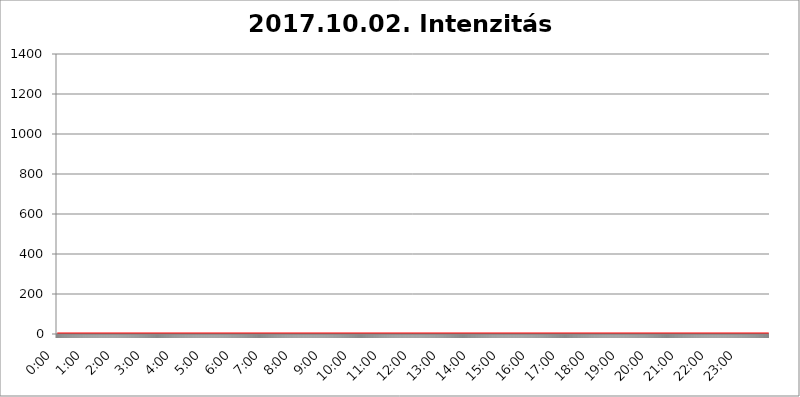
| Category | 2017.10.02. Intenzitás [W/m^2] |
|---|---|
| 0.0 | 0 |
| 0.0006944444444444445 | 0 |
| 0.001388888888888889 | 0 |
| 0.0020833333333333333 | 0 |
| 0.002777777777777778 | 0 |
| 0.003472222222222222 | 0 |
| 0.004166666666666667 | 0 |
| 0.004861111111111111 | 0 |
| 0.005555555555555556 | 0 |
| 0.0062499999999999995 | 0 |
| 0.006944444444444444 | 0 |
| 0.007638888888888889 | 0 |
| 0.008333333333333333 | 0 |
| 0.009027777777777779 | 0 |
| 0.009722222222222222 | 0 |
| 0.010416666666666666 | 0 |
| 0.011111111111111112 | 0 |
| 0.011805555555555555 | 0 |
| 0.012499999999999999 | 0 |
| 0.013194444444444444 | 0 |
| 0.013888888888888888 | 0 |
| 0.014583333333333332 | 0 |
| 0.015277777777777777 | 0 |
| 0.015972222222222224 | 0 |
| 0.016666666666666666 | 0 |
| 0.017361111111111112 | 0 |
| 0.018055555555555557 | 0 |
| 0.01875 | 0 |
| 0.019444444444444445 | 0 |
| 0.02013888888888889 | 0 |
| 0.020833333333333332 | 0 |
| 0.02152777777777778 | 0 |
| 0.022222222222222223 | 0 |
| 0.02291666666666667 | 0 |
| 0.02361111111111111 | 0 |
| 0.024305555555555556 | 0 |
| 0.024999999999999998 | 0 |
| 0.025694444444444447 | 0 |
| 0.02638888888888889 | 0 |
| 0.027083333333333334 | 0 |
| 0.027777777777777776 | 0 |
| 0.02847222222222222 | 0 |
| 0.029166666666666664 | 0 |
| 0.029861111111111113 | 0 |
| 0.030555555555555555 | 0 |
| 0.03125 | 0 |
| 0.03194444444444445 | 0 |
| 0.03263888888888889 | 0 |
| 0.03333333333333333 | 0 |
| 0.034027777777777775 | 0 |
| 0.034722222222222224 | 0 |
| 0.035416666666666666 | 0 |
| 0.036111111111111115 | 0 |
| 0.03680555555555556 | 0 |
| 0.0375 | 0 |
| 0.03819444444444444 | 0 |
| 0.03888888888888889 | 0 |
| 0.03958333333333333 | 0 |
| 0.04027777777777778 | 0 |
| 0.04097222222222222 | 0 |
| 0.041666666666666664 | 0 |
| 0.042361111111111106 | 0 |
| 0.04305555555555556 | 0 |
| 0.043750000000000004 | 0 |
| 0.044444444444444446 | 0 |
| 0.04513888888888889 | 0 |
| 0.04583333333333334 | 0 |
| 0.04652777777777778 | 0 |
| 0.04722222222222222 | 0 |
| 0.04791666666666666 | 0 |
| 0.04861111111111111 | 0 |
| 0.049305555555555554 | 0 |
| 0.049999999999999996 | 0 |
| 0.05069444444444445 | 0 |
| 0.051388888888888894 | 0 |
| 0.052083333333333336 | 0 |
| 0.05277777777777778 | 0 |
| 0.05347222222222222 | 0 |
| 0.05416666666666667 | 0 |
| 0.05486111111111111 | 0 |
| 0.05555555555555555 | 0 |
| 0.05625 | 0 |
| 0.05694444444444444 | 0 |
| 0.057638888888888885 | 0 |
| 0.05833333333333333 | 0 |
| 0.05902777777777778 | 0 |
| 0.059722222222222225 | 0 |
| 0.06041666666666667 | 0 |
| 0.061111111111111116 | 0 |
| 0.06180555555555556 | 0 |
| 0.0625 | 0 |
| 0.06319444444444444 | 0 |
| 0.06388888888888888 | 0 |
| 0.06458333333333334 | 0 |
| 0.06527777777777778 | 0 |
| 0.06597222222222222 | 0 |
| 0.06666666666666667 | 0 |
| 0.06736111111111111 | 0 |
| 0.06805555555555555 | 0 |
| 0.06874999999999999 | 0 |
| 0.06944444444444443 | 0 |
| 0.07013888888888889 | 0 |
| 0.07083333333333333 | 0 |
| 0.07152777777777779 | 0 |
| 0.07222222222222223 | 0 |
| 0.07291666666666667 | 0 |
| 0.07361111111111111 | 0 |
| 0.07430555555555556 | 0 |
| 0.075 | 0 |
| 0.07569444444444444 | 0 |
| 0.0763888888888889 | 0 |
| 0.07708333333333334 | 0 |
| 0.07777777777777778 | 0 |
| 0.07847222222222222 | 0 |
| 0.07916666666666666 | 0 |
| 0.0798611111111111 | 0 |
| 0.08055555555555556 | 0 |
| 0.08125 | 0 |
| 0.08194444444444444 | 0 |
| 0.08263888888888889 | 0 |
| 0.08333333333333333 | 0 |
| 0.08402777777777777 | 0 |
| 0.08472222222222221 | 0 |
| 0.08541666666666665 | 0 |
| 0.08611111111111112 | 0 |
| 0.08680555555555557 | 0 |
| 0.08750000000000001 | 0 |
| 0.08819444444444445 | 0 |
| 0.08888888888888889 | 0 |
| 0.08958333333333333 | 0 |
| 0.09027777777777778 | 0 |
| 0.09097222222222222 | 0 |
| 0.09166666666666667 | 0 |
| 0.09236111111111112 | 0 |
| 0.09305555555555556 | 0 |
| 0.09375 | 0 |
| 0.09444444444444444 | 0 |
| 0.09513888888888888 | 0 |
| 0.09583333333333333 | 0 |
| 0.09652777777777777 | 0 |
| 0.09722222222222222 | 0 |
| 0.09791666666666667 | 0 |
| 0.09861111111111111 | 0 |
| 0.09930555555555555 | 0 |
| 0.09999999999999999 | 0 |
| 0.10069444444444443 | 0 |
| 0.1013888888888889 | 0 |
| 0.10208333333333335 | 0 |
| 0.10277777777777779 | 0 |
| 0.10347222222222223 | 0 |
| 0.10416666666666667 | 0 |
| 0.10486111111111111 | 0 |
| 0.10555555555555556 | 0 |
| 0.10625 | 0 |
| 0.10694444444444444 | 0 |
| 0.1076388888888889 | 0 |
| 0.10833333333333334 | 0 |
| 0.10902777777777778 | 0 |
| 0.10972222222222222 | 0 |
| 0.1111111111111111 | 0 |
| 0.11180555555555556 | 0 |
| 0.11180555555555556 | 0 |
| 0.1125 | 0 |
| 0.11319444444444444 | 0 |
| 0.11388888888888889 | 0 |
| 0.11458333333333333 | 0 |
| 0.11527777777777777 | 0 |
| 0.11597222222222221 | 0 |
| 0.11666666666666665 | 0 |
| 0.1173611111111111 | 0 |
| 0.11805555555555557 | 0 |
| 0.11944444444444445 | 0 |
| 0.12013888888888889 | 0 |
| 0.12083333333333333 | 0 |
| 0.12152777777777778 | 0 |
| 0.12222222222222223 | 0 |
| 0.12291666666666667 | 0 |
| 0.12291666666666667 | 0 |
| 0.12361111111111112 | 0 |
| 0.12430555555555556 | 0 |
| 0.125 | 0 |
| 0.12569444444444444 | 0 |
| 0.12638888888888888 | 0 |
| 0.12708333333333333 | 0 |
| 0.16875 | 0 |
| 0.12847222222222224 | 0 |
| 0.12916666666666668 | 0 |
| 0.12986111111111112 | 0 |
| 0.13055555555555556 | 0 |
| 0.13125 | 0 |
| 0.13194444444444445 | 0 |
| 0.1326388888888889 | 0 |
| 0.13333333333333333 | 0 |
| 0.13402777777777777 | 0 |
| 0.13402777777777777 | 0 |
| 0.13472222222222222 | 0 |
| 0.13541666666666666 | 0 |
| 0.1361111111111111 | 0 |
| 0.13749999999999998 | 0 |
| 0.13819444444444443 | 0 |
| 0.1388888888888889 | 0 |
| 0.13958333333333334 | 0 |
| 0.14027777777777778 | 0 |
| 0.14097222222222222 | 0 |
| 0.14166666666666666 | 0 |
| 0.1423611111111111 | 0 |
| 0.14305555555555557 | 0 |
| 0.14375000000000002 | 0 |
| 0.14444444444444446 | 0 |
| 0.1451388888888889 | 0 |
| 0.1451388888888889 | 0 |
| 0.14652777777777778 | 0 |
| 0.14722222222222223 | 0 |
| 0.14791666666666667 | 0 |
| 0.1486111111111111 | 0 |
| 0.14930555555555555 | 0 |
| 0.15 | 0 |
| 0.15069444444444444 | 0 |
| 0.15138888888888888 | 0 |
| 0.15208333333333332 | 0 |
| 0.15277777777777776 | 0 |
| 0.15347222222222223 | 0 |
| 0.15416666666666667 | 0 |
| 0.15486111111111112 | 0 |
| 0.15555555555555556 | 0 |
| 0.15625 | 0 |
| 0.15694444444444444 | 0 |
| 0.15763888888888888 | 0 |
| 0.15833333333333333 | 0 |
| 0.15902777777777777 | 0 |
| 0.15972222222222224 | 0 |
| 0.16041666666666668 | 0 |
| 0.16111111111111112 | 0 |
| 0.16180555555555556 | 0 |
| 0.1625 | 0 |
| 0.16319444444444445 | 0 |
| 0.1638888888888889 | 0 |
| 0.16458333333333333 | 0 |
| 0.16527777777777777 | 0 |
| 0.16597222222222222 | 0 |
| 0.16666666666666666 | 0 |
| 0.1673611111111111 | 0 |
| 0.16805555555555554 | 0 |
| 0.16874999999999998 | 0 |
| 0.16944444444444443 | 0 |
| 0.17013888888888887 | 0 |
| 0.1708333333333333 | 0 |
| 0.17152777777777775 | 0 |
| 0.17222222222222225 | 0 |
| 0.1729166666666667 | 0 |
| 0.17361111111111113 | 0 |
| 0.17430555555555557 | 0 |
| 0.17500000000000002 | 0 |
| 0.17569444444444446 | 0 |
| 0.1763888888888889 | 0 |
| 0.17708333333333334 | 0 |
| 0.17777777777777778 | 0 |
| 0.17847222222222223 | 0 |
| 0.17916666666666667 | 0 |
| 0.1798611111111111 | 0 |
| 0.18055555555555555 | 0 |
| 0.18125 | 0 |
| 0.18194444444444444 | 0 |
| 0.1826388888888889 | 0 |
| 0.18333333333333335 | 0 |
| 0.1840277777777778 | 0 |
| 0.18472222222222223 | 0 |
| 0.18541666666666667 | 0 |
| 0.18611111111111112 | 0 |
| 0.18680555555555556 | 0 |
| 0.1875 | 0 |
| 0.18819444444444444 | 0 |
| 0.18888888888888888 | 0 |
| 0.18958333333333333 | 0 |
| 0.19027777777777777 | 0 |
| 0.1909722222222222 | 0 |
| 0.19166666666666665 | 0 |
| 0.19236111111111112 | 0 |
| 0.19305555555555554 | 0 |
| 0.19375 | 0 |
| 0.19444444444444445 | 0 |
| 0.1951388888888889 | 0 |
| 0.19583333333333333 | 0 |
| 0.19652777777777777 | 0 |
| 0.19722222222222222 | 0 |
| 0.19791666666666666 | 0 |
| 0.1986111111111111 | 0 |
| 0.19930555555555554 | 0 |
| 0.19999999999999998 | 0 |
| 0.20069444444444443 | 0 |
| 0.20138888888888887 | 0 |
| 0.2020833333333333 | 0 |
| 0.2027777777777778 | 0 |
| 0.2034722222222222 | 0 |
| 0.2041666666666667 | 0 |
| 0.20486111111111113 | 0 |
| 0.20555555555555557 | 0 |
| 0.20625000000000002 | 0 |
| 0.20694444444444446 | 0 |
| 0.2076388888888889 | 0 |
| 0.20833333333333334 | 0 |
| 0.20902777777777778 | 0 |
| 0.20972222222222223 | 0 |
| 0.21041666666666667 | 0 |
| 0.2111111111111111 | 0 |
| 0.21180555555555555 | 0 |
| 0.2125 | 0 |
| 0.21319444444444444 | 0 |
| 0.2138888888888889 | 0 |
| 0.21458333333333335 | 0 |
| 0.2152777777777778 | 0 |
| 0.21597222222222223 | 0 |
| 0.21666666666666667 | 0 |
| 0.21736111111111112 | 0 |
| 0.21805555555555556 | 0 |
| 0.21875 | 0 |
| 0.21944444444444444 | 0 |
| 0.22013888888888888 | 0 |
| 0.22083333333333333 | 0 |
| 0.22152777777777777 | 0 |
| 0.2222222222222222 | 0 |
| 0.22291666666666665 | 0 |
| 0.2236111111111111 | 0 |
| 0.22430555555555556 | 0 |
| 0.225 | 0 |
| 0.22569444444444445 | 0 |
| 0.2263888888888889 | 0 |
| 0.22708333333333333 | 0 |
| 0.22777777777777777 | 0 |
| 0.22847222222222222 | 0 |
| 0.22916666666666666 | 0 |
| 0.2298611111111111 | 0 |
| 0.23055555555555554 | 0 |
| 0.23124999999999998 | 0 |
| 0.23194444444444443 | 0 |
| 0.23263888888888887 | 0 |
| 0.2333333333333333 | 0 |
| 0.2340277777777778 | 0 |
| 0.2347222222222222 | 0 |
| 0.2354166666666667 | 0 |
| 0.23611111111111113 | 0 |
| 0.23680555555555557 | 0 |
| 0.23750000000000002 | 0 |
| 0.23819444444444446 | 0 |
| 0.2388888888888889 | 0 |
| 0.23958333333333334 | 0 |
| 0.24027777777777778 | 0 |
| 0.24097222222222223 | 0 |
| 0.24166666666666667 | 0 |
| 0.2423611111111111 | 0 |
| 0.24305555555555555 | 0 |
| 0.24375 | 0 |
| 0.24444444444444446 | 0 |
| 0.24513888888888888 | 0 |
| 0.24583333333333335 | 0 |
| 0.2465277777777778 | 0 |
| 0.24722222222222223 | 0 |
| 0.24791666666666667 | 0 |
| 0.24861111111111112 | 0 |
| 0.24930555555555556 | 0 |
| 0.25 | 0 |
| 0.25069444444444444 | 0 |
| 0.2513888888888889 | 0 |
| 0.2520833333333333 | 0 |
| 0.25277777777777777 | 0 |
| 0.2534722222222222 | 0 |
| 0.25416666666666665 | 0 |
| 0.2548611111111111 | 0 |
| 0.2555555555555556 | 0 |
| 0.25625000000000003 | 0 |
| 0.2569444444444445 | 0 |
| 0.2576388888888889 | 0 |
| 0.25833333333333336 | 0 |
| 0.2590277777777778 | 0 |
| 0.25972222222222224 | 0 |
| 0.2604166666666667 | 0 |
| 0.2611111111111111 | 0 |
| 0.26180555555555557 | 0 |
| 0.2625 | 0 |
| 0.26319444444444445 | 0 |
| 0.2638888888888889 | 0 |
| 0.26458333333333334 | 0 |
| 0.2652777777777778 | 0 |
| 0.2659722222222222 | 0 |
| 0.26666666666666666 | 0 |
| 0.2673611111111111 | 0 |
| 0.26805555555555555 | 0 |
| 0.26875 | 0 |
| 0.26944444444444443 | 0 |
| 0.2701388888888889 | 0 |
| 0.2708333333333333 | 0 |
| 0.27152777777777776 | 0 |
| 0.2722222222222222 | 0 |
| 0.27291666666666664 | 0 |
| 0.2736111111111111 | 0 |
| 0.2743055555555555 | 0 |
| 0.27499999999999997 | 0 |
| 0.27569444444444446 | 0 |
| 0.27638888888888885 | 0 |
| 0.27708333333333335 | 0 |
| 0.2777777777777778 | 0 |
| 0.27847222222222223 | 0 |
| 0.2791666666666667 | 0 |
| 0.2798611111111111 | 0 |
| 0.28055555555555556 | 0 |
| 0.28125 | 0 |
| 0.28194444444444444 | 0 |
| 0.2826388888888889 | 0 |
| 0.2833333333333333 | 0 |
| 0.28402777777777777 | 0 |
| 0.2847222222222222 | 0 |
| 0.28541666666666665 | 0 |
| 0.28611111111111115 | 0 |
| 0.28680555555555554 | 0 |
| 0.28750000000000003 | 0 |
| 0.2881944444444445 | 0 |
| 0.2888888888888889 | 0 |
| 0.28958333333333336 | 0 |
| 0.2902777777777778 | 0 |
| 0.29097222222222224 | 0 |
| 0.2916666666666667 | 0 |
| 0.2923611111111111 | 0 |
| 0.29305555555555557 | 0 |
| 0.29375 | 0 |
| 0.29444444444444445 | 0 |
| 0.2951388888888889 | 0 |
| 0.29583333333333334 | 0 |
| 0.2965277777777778 | 0 |
| 0.2972222222222222 | 0 |
| 0.29791666666666666 | 0 |
| 0.2986111111111111 | 0 |
| 0.29930555555555555 | 0 |
| 0.3 | 0 |
| 0.30069444444444443 | 0 |
| 0.3013888888888889 | 0 |
| 0.3020833333333333 | 0 |
| 0.30277777777777776 | 0 |
| 0.3034722222222222 | 0 |
| 0.30416666666666664 | 0 |
| 0.3048611111111111 | 0 |
| 0.3055555555555555 | 0 |
| 0.30624999999999997 | 0 |
| 0.3069444444444444 | 0 |
| 0.3076388888888889 | 0 |
| 0.30833333333333335 | 0 |
| 0.3090277777777778 | 0 |
| 0.30972222222222223 | 0 |
| 0.3104166666666667 | 0 |
| 0.3111111111111111 | 0 |
| 0.31180555555555556 | 0 |
| 0.3125 | 0 |
| 0.31319444444444444 | 0 |
| 0.3138888888888889 | 0 |
| 0.3145833333333333 | 0 |
| 0.31527777777777777 | 0 |
| 0.3159722222222222 | 0 |
| 0.31666666666666665 | 0 |
| 0.31736111111111115 | 0 |
| 0.31805555555555554 | 0 |
| 0.31875000000000003 | 0 |
| 0.3194444444444445 | 0 |
| 0.3201388888888889 | 0 |
| 0.32083333333333336 | 0 |
| 0.3215277777777778 | 0 |
| 0.32222222222222224 | 0 |
| 0.3229166666666667 | 0 |
| 0.3236111111111111 | 0 |
| 0.32430555555555557 | 0 |
| 0.325 | 0 |
| 0.32569444444444445 | 0 |
| 0.3263888888888889 | 0 |
| 0.32708333333333334 | 0 |
| 0.3277777777777778 | 0 |
| 0.3284722222222222 | 0 |
| 0.32916666666666666 | 0 |
| 0.3298611111111111 | 0 |
| 0.33055555555555555 | 0 |
| 0.33125 | 0 |
| 0.33194444444444443 | 0 |
| 0.3326388888888889 | 0 |
| 0.3333333333333333 | 0 |
| 0.3340277777777778 | 0 |
| 0.3347222222222222 | 0 |
| 0.3354166666666667 | 0 |
| 0.3361111111111111 | 0 |
| 0.3368055555555556 | 0 |
| 0.33749999999999997 | 0 |
| 0.33819444444444446 | 0 |
| 0.33888888888888885 | 0 |
| 0.33958333333333335 | 0 |
| 0.34027777777777773 | 0 |
| 0.34097222222222223 | 0 |
| 0.3416666666666666 | 0 |
| 0.3423611111111111 | 0 |
| 0.3430555555555555 | 0 |
| 0.34375 | 0 |
| 0.3444444444444445 | 0 |
| 0.3451388888888889 | 0 |
| 0.3458333333333334 | 0 |
| 0.34652777777777777 | 0 |
| 0.34722222222222227 | 0 |
| 0.34791666666666665 | 0 |
| 0.34861111111111115 | 0 |
| 0.34930555555555554 | 0 |
| 0.35000000000000003 | 0 |
| 0.3506944444444444 | 0 |
| 0.3513888888888889 | 0 |
| 0.3520833333333333 | 0 |
| 0.3527777777777778 | 0 |
| 0.3534722222222222 | 0 |
| 0.3541666666666667 | 0 |
| 0.3548611111111111 | 0 |
| 0.35555555555555557 | 0 |
| 0.35625 | 0 |
| 0.35694444444444445 | 0 |
| 0.3576388888888889 | 0 |
| 0.35833333333333334 | 0 |
| 0.3590277777777778 | 0 |
| 0.3597222222222222 | 0 |
| 0.36041666666666666 | 0 |
| 0.3611111111111111 | 0 |
| 0.36180555555555555 | 0 |
| 0.3625 | 0 |
| 0.36319444444444443 | 0 |
| 0.3638888888888889 | 0 |
| 0.3645833333333333 | 0 |
| 0.3652777777777778 | 0 |
| 0.3659722222222222 | 0 |
| 0.3666666666666667 | 0 |
| 0.3673611111111111 | 0 |
| 0.3680555555555556 | 0 |
| 0.36874999999999997 | 0 |
| 0.36944444444444446 | 0 |
| 0.37013888888888885 | 0 |
| 0.37083333333333335 | 0 |
| 0.37152777777777773 | 0 |
| 0.37222222222222223 | 0 |
| 0.3729166666666666 | 0 |
| 0.3736111111111111 | 0 |
| 0.3743055555555555 | 0 |
| 0.375 | 0 |
| 0.3756944444444445 | 0 |
| 0.3763888888888889 | 0 |
| 0.3770833333333334 | 0 |
| 0.37777777777777777 | 0 |
| 0.37847222222222227 | 0 |
| 0.37916666666666665 | 0 |
| 0.37986111111111115 | 0 |
| 0.38055555555555554 | 0 |
| 0.38125000000000003 | 0 |
| 0.3819444444444444 | 0 |
| 0.3826388888888889 | 0 |
| 0.3833333333333333 | 0 |
| 0.3840277777777778 | 0 |
| 0.3847222222222222 | 0 |
| 0.3854166666666667 | 0 |
| 0.3861111111111111 | 0 |
| 0.38680555555555557 | 0 |
| 0.3875 | 0 |
| 0.38819444444444445 | 0 |
| 0.3888888888888889 | 0 |
| 0.38958333333333334 | 0 |
| 0.3902777777777778 | 0 |
| 0.3909722222222222 | 0 |
| 0.39166666666666666 | 0 |
| 0.3923611111111111 | 0 |
| 0.39305555555555555 | 0 |
| 0.39375 | 0 |
| 0.39444444444444443 | 0 |
| 0.3951388888888889 | 0 |
| 0.3958333333333333 | 0 |
| 0.3965277777777778 | 0 |
| 0.3972222222222222 | 0 |
| 0.3979166666666667 | 0 |
| 0.3986111111111111 | 0 |
| 0.3993055555555556 | 0 |
| 0.39999999999999997 | 0 |
| 0.40069444444444446 | 0 |
| 0.40138888888888885 | 0 |
| 0.40208333333333335 | 0 |
| 0.40277777777777773 | 0 |
| 0.40347222222222223 | 0 |
| 0.4041666666666666 | 0 |
| 0.4048611111111111 | 0 |
| 0.4055555555555555 | 0 |
| 0.40625 | 0 |
| 0.4069444444444445 | 0 |
| 0.4076388888888889 | 0 |
| 0.4083333333333334 | 0 |
| 0.40902777777777777 | 0 |
| 0.40972222222222227 | 0 |
| 0.41041666666666665 | 0 |
| 0.41111111111111115 | 0 |
| 0.41180555555555554 | 0 |
| 0.41250000000000003 | 0 |
| 0.4131944444444444 | 0 |
| 0.4138888888888889 | 0 |
| 0.4145833333333333 | 0 |
| 0.4152777777777778 | 0 |
| 0.4159722222222222 | 0 |
| 0.4166666666666667 | 0 |
| 0.4173611111111111 | 0 |
| 0.41805555555555557 | 0 |
| 0.41875 | 0 |
| 0.41944444444444445 | 0 |
| 0.4201388888888889 | 0 |
| 0.42083333333333334 | 0 |
| 0.4215277777777778 | 0 |
| 0.4222222222222222 | 0 |
| 0.42291666666666666 | 0 |
| 0.4236111111111111 | 0 |
| 0.42430555555555555 | 0 |
| 0.425 | 0 |
| 0.42569444444444443 | 0 |
| 0.4263888888888889 | 0 |
| 0.4270833333333333 | 0 |
| 0.4277777777777778 | 0 |
| 0.4284722222222222 | 0 |
| 0.4291666666666667 | 0 |
| 0.4298611111111111 | 0 |
| 0.4305555555555556 | 0 |
| 0.43124999999999997 | 0 |
| 0.43194444444444446 | 0 |
| 0.43263888888888885 | 0 |
| 0.43333333333333335 | 0 |
| 0.43402777777777773 | 0 |
| 0.43472222222222223 | 0 |
| 0.4354166666666666 | 0 |
| 0.4361111111111111 | 0 |
| 0.4368055555555555 | 0 |
| 0.4375 | 0 |
| 0.4381944444444445 | 0 |
| 0.4388888888888889 | 0 |
| 0.4395833333333334 | 0 |
| 0.44027777777777777 | 0 |
| 0.44097222222222227 | 0 |
| 0.44166666666666665 | 0 |
| 0.44236111111111115 | 0 |
| 0.44305555555555554 | 0 |
| 0.44375000000000003 | 0 |
| 0.4444444444444444 | 0 |
| 0.4451388888888889 | 0 |
| 0.4458333333333333 | 0 |
| 0.4465277777777778 | 0 |
| 0.4472222222222222 | 0 |
| 0.4479166666666667 | 0 |
| 0.4486111111111111 | 0 |
| 0.44930555555555557 | 0 |
| 0.45 | 0 |
| 0.45069444444444445 | 0 |
| 0.4513888888888889 | 0 |
| 0.45208333333333334 | 0 |
| 0.4527777777777778 | 0 |
| 0.4534722222222222 | 0 |
| 0.45416666666666666 | 0 |
| 0.4548611111111111 | 0 |
| 0.45555555555555555 | 0 |
| 0.45625 | 0 |
| 0.45694444444444443 | 0 |
| 0.4576388888888889 | 0 |
| 0.4583333333333333 | 0 |
| 0.4590277777777778 | 0 |
| 0.4597222222222222 | 0 |
| 0.4604166666666667 | 0 |
| 0.4611111111111111 | 0 |
| 0.4618055555555556 | 0 |
| 0.46249999999999997 | 0 |
| 0.46319444444444446 | 0 |
| 0.46388888888888885 | 0 |
| 0.46458333333333335 | 0 |
| 0.46527777777777773 | 0 |
| 0.46597222222222223 | 0 |
| 0.4666666666666666 | 0 |
| 0.4673611111111111 | 0 |
| 0.4680555555555555 | 0 |
| 0.46875 | 0 |
| 0.4694444444444445 | 0 |
| 0.4701388888888889 | 0 |
| 0.4708333333333334 | 0 |
| 0.47152777777777777 | 0 |
| 0.47222222222222227 | 0 |
| 0.47291666666666665 | 0 |
| 0.47361111111111115 | 0 |
| 0.47430555555555554 | 0 |
| 0.47500000000000003 | 0 |
| 0.4756944444444444 | 0 |
| 0.4763888888888889 | 0 |
| 0.4770833333333333 | 0 |
| 0.4777777777777778 | 0 |
| 0.4784722222222222 | 0 |
| 0.4791666666666667 | 0 |
| 0.4798611111111111 | 0 |
| 0.48055555555555557 | 0 |
| 0.48125 | 0 |
| 0.48194444444444445 | 0 |
| 0.4826388888888889 | 0 |
| 0.48333333333333334 | 0 |
| 0.4840277777777778 | 0 |
| 0.4847222222222222 | 0 |
| 0.48541666666666666 | 0 |
| 0.4861111111111111 | 0 |
| 0.48680555555555555 | 0 |
| 0.4875 | 0 |
| 0.48819444444444443 | 0 |
| 0.4888888888888889 | 0 |
| 0.4895833333333333 | 0 |
| 0.4902777777777778 | 0 |
| 0.4909722222222222 | 0 |
| 0.4916666666666667 | 0 |
| 0.4923611111111111 | 0 |
| 0.4930555555555556 | 0 |
| 0.49374999999999997 | 0 |
| 0.49444444444444446 | 0 |
| 0.49513888888888885 | 0 |
| 0.49583333333333335 | 0 |
| 0.49652777777777773 | 0 |
| 0.49722222222222223 | 0 |
| 0.4979166666666666 | 0 |
| 0.4986111111111111 | 0 |
| 0.4993055555555555 | 0 |
| 0.5 | 0 |
| 0.5006944444444444 | 0 |
| 0.5013888888888889 | 0 |
| 0.5020833333333333 | 0 |
| 0.5027777777777778 | 0 |
| 0.5034722222222222 | 0 |
| 0.5041666666666667 | 0 |
| 0.5048611111111111 | 0 |
| 0.5055555555555555 | 0 |
| 0.50625 | 0 |
| 0.5069444444444444 | 0 |
| 0.5076388888888889 | 0 |
| 0.5083333333333333 | 0 |
| 0.5090277777777777 | 0 |
| 0.5097222222222222 | 0 |
| 0.5104166666666666 | 0 |
| 0.5111111111111112 | 0 |
| 0.5118055555555555 | 0 |
| 0.5125000000000001 | 0 |
| 0.5131944444444444 | 0 |
| 0.513888888888889 | 0 |
| 0.5145833333333333 | 0 |
| 0.5152777777777778 | 0 |
| 0.5159722222222222 | 0 |
| 0.5166666666666667 | 0 |
| 0.517361111111111 | 0 |
| 0.5180555555555556 | 0 |
| 0.5187499999999999 | 0 |
| 0.5194444444444445 | 0 |
| 0.5201388888888888 | 0 |
| 0.5208333333333334 | 0 |
| 0.5215277777777778 | 0 |
| 0.5222222222222223 | 0 |
| 0.5229166666666667 | 0 |
| 0.5236111111111111 | 0 |
| 0.5243055555555556 | 0 |
| 0.525 | 0 |
| 0.5256944444444445 | 0 |
| 0.5263888888888889 | 0 |
| 0.5270833333333333 | 0 |
| 0.5277777777777778 | 0 |
| 0.5284722222222222 | 0 |
| 0.5291666666666667 | 0 |
| 0.5298611111111111 | 0 |
| 0.5305555555555556 | 0 |
| 0.53125 | 0 |
| 0.5319444444444444 | 0 |
| 0.5326388888888889 | 0 |
| 0.5333333333333333 | 0 |
| 0.5340277777777778 | 0 |
| 0.5347222222222222 | 0 |
| 0.5354166666666667 | 0 |
| 0.5361111111111111 | 0 |
| 0.5368055555555555 | 0 |
| 0.5375 | 0 |
| 0.5381944444444444 | 0 |
| 0.5388888888888889 | 0 |
| 0.5395833333333333 | 0 |
| 0.5402777777777777 | 0 |
| 0.5409722222222222 | 0 |
| 0.5416666666666666 | 0 |
| 0.5423611111111112 | 0 |
| 0.5430555555555555 | 0 |
| 0.5437500000000001 | 0 |
| 0.5444444444444444 | 0 |
| 0.545138888888889 | 0 |
| 0.5458333333333333 | 0 |
| 0.5465277777777778 | 0 |
| 0.5472222222222222 | 0 |
| 0.5479166666666667 | 0 |
| 0.548611111111111 | 0 |
| 0.5493055555555556 | 0 |
| 0.5499999999999999 | 0 |
| 0.5506944444444445 | 0 |
| 0.5513888888888888 | 0 |
| 0.5520833333333334 | 0 |
| 0.5527777777777778 | 0 |
| 0.5534722222222223 | 0 |
| 0.5541666666666667 | 0 |
| 0.5548611111111111 | 0 |
| 0.5555555555555556 | 0 |
| 0.55625 | 0 |
| 0.5569444444444445 | 0 |
| 0.5576388888888889 | 0 |
| 0.5583333333333333 | 0 |
| 0.5590277777777778 | 0 |
| 0.5597222222222222 | 0 |
| 0.5604166666666667 | 0 |
| 0.5611111111111111 | 0 |
| 0.5618055555555556 | 0 |
| 0.5625 | 0 |
| 0.5631944444444444 | 0 |
| 0.5638888888888889 | 0 |
| 0.5645833333333333 | 0 |
| 0.5652777777777778 | 0 |
| 0.5659722222222222 | 0 |
| 0.5666666666666667 | 0 |
| 0.5673611111111111 | 0 |
| 0.5680555555555555 | 0 |
| 0.56875 | 0 |
| 0.5694444444444444 | 0 |
| 0.5701388888888889 | 0 |
| 0.5708333333333333 | 0 |
| 0.5715277777777777 | 0 |
| 0.5722222222222222 | 0 |
| 0.5729166666666666 | 0 |
| 0.5736111111111112 | 0 |
| 0.5743055555555555 | 0 |
| 0.5750000000000001 | 0 |
| 0.5756944444444444 | 0 |
| 0.576388888888889 | 0 |
| 0.5770833333333333 | 0 |
| 0.5777777777777778 | 0 |
| 0.5784722222222222 | 0 |
| 0.5791666666666667 | 0 |
| 0.579861111111111 | 0 |
| 0.5805555555555556 | 0 |
| 0.5812499999999999 | 0 |
| 0.5819444444444445 | 0 |
| 0.5826388888888888 | 0 |
| 0.5833333333333334 | 0 |
| 0.5840277777777778 | 0 |
| 0.5847222222222223 | 0 |
| 0.5854166666666667 | 0 |
| 0.5861111111111111 | 0 |
| 0.5868055555555556 | 0 |
| 0.5875 | 0 |
| 0.5881944444444445 | 0 |
| 0.5888888888888889 | 0 |
| 0.5895833333333333 | 0 |
| 0.5902777777777778 | 0 |
| 0.5909722222222222 | 0 |
| 0.5916666666666667 | 0 |
| 0.5923611111111111 | 0 |
| 0.5930555555555556 | 0 |
| 0.59375 | 0 |
| 0.5944444444444444 | 0 |
| 0.5951388888888889 | 0 |
| 0.5958333333333333 | 0 |
| 0.5965277777777778 | 0 |
| 0.5972222222222222 | 0 |
| 0.5979166666666667 | 0 |
| 0.5986111111111111 | 0 |
| 0.5993055555555555 | 0 |
| 0.6 | 0 |
| 0.6006944444444444 | 0 |
| 0.6013888888888889 | 0 |
| 0.6020833333333333 | 0 |
| 0.6027777777777777 | 0 |
| 0.6034722222222222 | 0 |
| 0.6041666666666666 | 0 |
| 0.6048611111111112 | 0 |
| 0.6055555555555555 | 0 |
| 0.6062500000000001 | 0 |
| 0.6069444444444444 | 0 |
| 0.607638888888889 | 0 |
| 0.6083333333333333 | 0 |
| 0.6090277777777778 | 0 |
| 0.6097222222222222 | 0 |
| 0.6104166666666667 | 0 |
| 0.611111111111111 | 0 |
| 0.6118055555555556 | 0 |
| 0.6124999999999999 | 0 |
| 0.6131944444444445 | 0 |
| 0.6138888888888888 | 0 |
| 0.6145833333333334 | 0 |
| 0.6152777777777778 | 0 |
| 0.6159722222222223 | 0 |
| 0.6166666666666667 | 0 |
| 0.6173611111111111 | 0 |
| 0.6180555555555556 | 0 |
| 0.61875 | 0 |
| 0.6194444444444445 | 0 |
| 0.6201388888888889 | 0 |
| 0.6208333333333333 | 0 |
| 0.6215277777777778 | 0 |
| 0.6222222222222222 | 0 |
| 0.6229166666666667 | 0 |
| 0.6236111111111111 | 0 |
| 0.6243055555555556 | 0 |
| 0.625 | 0 |
| 0.6256944444444444 | 0 |
| 0.6263888888888889 | 0 |
| 0.6270833333333333 | 0 |
| 0.6277777777777778 | 0 |
| 0.6284722222222222 | 0 |
| 0.6291666666666667 | 0 |
| 0.6298611111111111 | 0 |
| 0.6305555555555555 | 0 |
| 0.63125 | 0 |
| 0.6319444444444444 | 0 |
| 0.6326388888888889 | 0 |
| 0.6333333333333333 | 0 |
| 0.6340277777777777 | 0 |
| 0.6347222222222222 | 0 |
| 0.6354166666666666 | 0 |
| 0.6361111111111112 | 0 |
| 0.6368055555555555 | 0 |
| 0.6375000000000001 | 0 |
| 0.6381944444444444 | 0 |
| 0.638888888888889 | 0 |
| 0.6395833333333333 | 0 |
| 0.6402777777777778 | 0 |
| 0.6409722222222222 | 0 |
| 0.6416666666666667 | 0 |
| 0.642361111111111 | 0 |
| 0.6430555555555556 | 0 |
| 0.6437499999999999 | 0 |
| 0.6444444444444445 | 0 |
| 0.6451388888888888 | 0 |
| 0.6458333333333334 | 0 |
| 0.6465277777777778 | 0 |
| 0.6472222222222223 | 0 |
| 0.6479166666666667 | 0 |
| 0.6486111111111111 | 0 |
| 0.6493055555555556 | 0 |
| 0.65 | 0 |
| 0.6506944444444445 | 0 |
| 0.6513888888888889 | 0 |
| 0.6520833333333333 | 0 |
| 0.6527777777777778 | 0 |
| 0.6534722222222222 | 0 |
| 0.6541666666666667 | 0 |
| 0.6548611111111111 | 0 |
| 0.6555555555555556 | 0 |
| 0.65625 | 0 |
| 0.6569444444444444 | 0 |
| 0.6576388888888889 | 0 |
| 0.6583333333333333 | 0 |
| 0.6590277777777778 | 0 |
| 0.6597222222222222 | 0 |
| 0.6604166666666667 | 0 |
| 0.6611111111111111 | 0 |
| 0.6618055555555555 | 0 |
| 0.6625 | 0 |
| 0.6631944444444444 | 0 |
| 0.6638888888888889 | 0 |
| 0.6645833333333333 | 0 |
| 0.6652777777777777 | 0 |
| 0.6659722222222222 | 0 |
| 0.6666666666666666 | 0 |
| 0.6673611111111111 | 0 |
| 0.6680555555555556 | 0 |
| 0.6687500000000001 | 0 |
| 0.6694444444444444 | 0 |
| 0.6701388888888888 | 0 |
| 0.6708333333333334 | 0 |
| 0.6715277777777778 | 0 |
| 0.6722222222222222 | 0 |
| 0.6729166666666666 | 0 |
| 0.6736111111111112 | 0 |
| 0.6743055555555556 | 0 |
| 0.6749999999999999 | 0 |
| 0.6756944444444444 | 0 |
| 0.6763888888888889 | 0 |
| 0.6770833333333334 | 0 |
| 0.6777777777777777 | 0 |
| 0.6784722222222223 | 0 |
| 0.6791666666666667 | 0 |
| 0.6798611111111111 | 0 |
| 0.6805555555555555 | 0 |
| 0.68125 | 0 |
| 0.6819444444444445 | 0 |
| 0.6826388888888889 | 0 |
| 0.6833333333333332 | 0 |
| 0.6840277777777778 | 0 |
| 0.6847222222222222 | 0 |
| 0.6854166666666667 | 0 |
| 0.686111111111111 | 0 |
| 0.6868055555555556 | 0 |
| 0.6875 | 0 |
| 0.6881944444444444 | 0 |
| 0.688888888888889 | 0 |
| 0.6895833333333333 | 0 |
| 0.6902777777777778 | 0 |
| 0.6909722222222222 | 0 |
| 0.6916666666666668 | 0 |
| 0.6923611111111111 | 0 |
| 0.6930555555555555 | 0 |
| 0.69375 | 0 |
| 0.6944444444444445 | 0 |
| 0.6951388888888889 | 0 |
| 0.6958333333333333 | 0 |
| 0.6965277777777777 | 0 |
| 0.6972222222222223 | 0 |
| 0.6979166666666666 | 0 |
| 0.6986111111111111 | 0 |
| 0.6993055555555556 | 0 |
| 0.7000000000000001 | 0 |
| 0.7006944444444444 | 0 |
| 0.7013888888888888 | 0 |
| 0.7020833333333334 | 0 |
| 0.7027777777777778 | 0 |
| 0.7034722222222222 | 0 |
| 0.7041666666666666 | 0 |
| 0.7048611111111112 | 0 |
| 0.7055555555555556 | 0 |
| 0.7062499999999999 | 0 |
| 0.7069444444444444 | 0 |
| 0.7076388888888889 | 0 |
| 0.7083333333333334 | 0 |
| 0.7090277777777777 | 0 |
| 0.7097222222222223 | 0 |
| 0.7104166666666667 | 0 |
| 0.7111111111111111 | 0 |
| 0.7118055555555555 | 0 |
| 0.7125 | 0 |
| 0.7131944444444445 | 0 |
| 0.7138888888888889 | 0 |
| 0.7145833333333332 | 0 |
| 0.7152777777777778 | 0 |
| 0.7159722222222222 | 0 |
| 0.7166666666666667 | 0 |
| 0.717361111111111 | 0 |
| 0.7180555555555556 | 0 |
| 0.71875 | 0 |
| 0.7194444444444444 | 0 |
| 0.720138888888889 | 0 |
| 0.7208333333333333 | 0 |
| 0.7215277777777778 | 0 |
| 0.7222222222222222 | 0 |
| 0.7229166666666668 | 0 |
| 0.7236111111111111 | 0 |
| 0.7243055555555555 | 0 |
| 0.725 | 0 |
| 0.7256944444444445 | 0 |
| 0.7263888888888889 | 0 |
| 0.7270833333333333 | 0 |
| 0.7277777777777777 | 0 |
| 0.7284722222222223 | 0 |
| 0.7291666666666666 | 0 |
| 0.7298611111111111 | 0 |
| 0.7305555555555556 | 0 |
| 0.7312500000000001 | 0 |
| 0.7319444444444444 | 0 |
| 0.7326388888888888 | 0 |
| 0.7333333333333334 | 0 |
| 0.7340277777777778 | 0 |
| 0.7347222222222222 | 0 |
| 0.7354166666666666 | 0 |
| 0.7361111111111112 | 0 |
| 0.7368055555555556 | 0 |
| 0.7374999999999999 | 0 |
| 0.7381944444444444 | 0 |
| 0.7388888888888889 | 0 |
| 0.7395833333333334 | 0 |
| 0.7402777777777777 | 0 |
| 0.7409722222222223 | 0 |
| 0.7416666666666667 | 0 |
| 0.7423611111111111 | 0 |
| 0.7430555555555555 | 0 |
| 0.74375 | 0 |
| 0.7444444444444445 | 0 |
| 0.7451388888888889 | 0 |
| 0.7458333333333332 | 0 |
| 0.7465277777777778 | 0 |
| 0.7472222222222222 | 0 |
| 0.7479166666666667 | 0 |
| 0.748611111111111 | 0 |
| 0.7493055555555556 | 0 |
| 0.75 | 0 |
| 0.7506944444444444 | 0 |
| 0.751388888888889 | 0 |
| 0.7520833333333333 | 0 |
| 0.7527777777777778 | 0 |
| 0.7534722222222222 | 0 |
| 0.7541666666666668 | 0 |
| 0.7548611111111111 | 0 |
| 0.7555555555555555 | 0 |
| 0.75625 | 0 |
| 0.7569444444444445 | 0 |
| 0.7576388888888889 | 0 |
| 0.7583333333333333 | 0 |
| 0.7590277777777777 | 0 |
| 0.7597222222222223 | 0 |
| 0.7604166666666666 | 0 |
| 0.7611111111111111 | 0 |
| 0.7618055555555556 | 0 |
| 0.7625000000000001 | 0 |
| 0.7631944444444444 | 0 |
| 0.7638888888888888 | 0 |
| 0.7645833333333334 | 0 |
| 0.7652777777777778 | 0 |
| 0.7659722222222222 | 0 |
| 0.7666666666666666 | 0 |
| 0.7673611111111112 | 0 |
| 0.7680555555555556 | 0 |
| 0.7687499999999999 | 0 |
| 0.7694444444444444 | 0 |
| 0.7701388888888889 | 0 |
| 0.7708333333333334 | 0 |
| 0.7715277777777777 | 0 |
| 0.7722222222222223 | 0 |
| 0.7729166666666667 | 0 |
| 0.7736111111111111 | 0 |
| 0.7743055555555555 | 0 |
| 0.775 | 0 |
| 0.7756944444444445 | 0 |
| 0.7763888888888889 | 0 |
| 0.7770833333333332 | 0 |
| 0.7777777777777778 | 0 |
| 0.7784722222222222 | 0 |
| 0.7791666666666667 | 0 |
| 0.779861111111111 | 0 |
| 0.7805555555555556 | 0 |
| 0.78125 | 0 |
| 0.7819444444444444 | 0 |
| 0.782638888888889 | 0 |
| 0.7833333333333333 | 0 |
| 0.7840277777777778 | 0 |
| 0.7847222222222222 | 0 |
| 0.7854166666666668 | 0 |
| 0.7861111111111111 | 0 |
| 0.7868055555555555 | 0 |
| 0.7875 | 0 |
| 0.7881944444444445 | 0 |
| 0.7888888888888889 | 0 |
| 0.7895833333333333 | 0 |
| 0.7902777777777777 | 0 |
| 0.7909722222222223 | 0 |
| 0.7916666666666666 | 0 |
| 0.7923611111111111 | 0 |
| 0.7930555555555556 | 0 |
| 0.7937500000000001 | 0 |
| 0.7944444444444444 | 0 |
| 0.7951388888888888 | 0 |
| 0.7958333333333334 | 0 |
| 0.7965277777777778 | 0 |
| 0.7972222222222222 | 0 |
| 0.7979166666666666 | 0 |
| 0.7986111111111112 | 0 |
| 0.7993055555555556 | 0 |
| 0.7999999999999999 | 0 |
| 0.8006944444444444 | 0 |
| 0.8013888888888889 | 0 |
| 0.8020833333333334 | 0 |
| 0.8027777777777777 | 0 |
| 0.8034722222222223 | 0 |
| 0.8041666666666667 | 0 |
| 0.8048611111111111 | 0 |
| 0.8055555555555555 | 0 |
| 0.80625 | 0 |
| 0.8069444444444445 | 0 |
| 0.8076388888888889 | 0 |
| 0.8083333333333332 | 0 |
| 0.8090277777777778 | 0 |
| 0.8097222222222222 | 0 |
| 0.8104166666666667 | 0 |
| 0.811111111111111 | 0 |
| 0.8118055555555556 | 0 |
| 0.8125 | 0 |
| 0.8131944444444444 | 0 |
| 0.813888888888889 | 0 |
| 0.8145833333333333 | 0 |
| 0.8152777777777778 | 0 |
| 0.8159722222222222 | 0 |
| 0.8166666666666668 | 0 |
| 0.8173611111111111 | 0 |
| 0.8180555555555555 | 0 |
| 0.81875 | 0 |
| 0.8194444444444445 | 0 |
| 0.8201388888888889 | 0 |
| 0.8208333333333333 | 0 |
| 0.8215277777777777 | 0 |
| 0.8222222222222223 | 0 |
| 0.8229166666666666 | 0 |
| 0.8236111111111111 | 0 |
| 0.8243055555555556 | 0 |
| 0.8250000000000001 | 0 |
| 0.8256944444444444 | 0 |
| 0.8263888888888888 | 0 |
| 0.8270833333333334 | 0 |
| 0.8277777777777778 | 0 |
| 0.8284722222222222 | 0 |
| 0.8291666666666666 | 0 |
| 0.8298611111111112 | 0 |
| 0.8305555555555556 | 0 |
| 0.8312499999999999 | 0 |
| 0.8319444444444444 | 0 |
| 0.8326388888888889 | 0 |
| 0.8333333333333334 | 0 |
| 0.8340277777777777 | 0 |
| 0.8347222222222223 | 0 |
| 0.8354166666666667 | 0 |
| 0.8361111111111111 | 0 |
| 0.8368055555555555 | 0 |
| 0.8375 | 0 |
| 0.8381944444444445 | 0 |
| 0.8388888888888889 | 0 |
| 0.8395833333333332 | 0 |
| 0.8402777777777778 | 0 |
| 0.8409722222222222 | 0 |
| 0.8416666666666667 | 0 |
| 0.842361111111111 | 0 |
| 0.8430555555555556 | 0 |
| 0.84375 | 0 |
| 0.8444444444444444 | 0 |
| 0.845138888888889 | 0 |
| 0.8458333333333333 | 0 |
| 0.8465277777777778 | 0 |
| 0.8472222222222222 | 0 |
| 0.8479166666666668 | 0 |
| 0.8486111111111111 | 0 |
| 0.8493055555555555 | 0 |
| 0.85 | 0 |
| 0.8506944444444445 | 0 |
| 0.8513888888888889 | 0 |
| 0.8520833333333333 | 0 |
| 0.8527777777777777 | 0 |
| 0.8534722222222223 | 0 |
| 0.8541666666666666 | 0 |
| 0.8548611111111111 | 0 |
| 0.8555555555555556 | 0 |
| 0.8562500000000001 | 0 |
| 0.8569444444444444 | 0 |
| 0.8576388888888888 | 0 |
| 0.8583333333333334 | 0 |
| 0.8590277777777778 | 0 |
| 0.8597222222222222 | 0 |
| 0.8604166666666666 | 0 |
| 0.8611111111111112 | 0 |
| 0.8618055555555556 | 0 |
| 0.8624999999999999 | 0 |
| 0.8631944444444444 | 0 |
| 0.8638888888888889 | 0 |
| 0.8645833333333334 | 0 |
| 0.8652777777777777 | 0 |
| 0.8659722222222223 | 0 |
| 0.8666666666666667 | 0 |
| 0.8673611111111111 | 0 |
| 0.8680555555555555 | 0 |
| 0.86875 | 0 |
| 0.8694444444444445 | 0 |
| 0.8701388888888889 | 0 |
| 0.8708333333333332 | 0 |
| 0.8715277777777778 | 0 |
| 0.8722222222222222 | 0 |
| 0.8729166666666667 | 0 |
| 0.873611111111111 | 0 |
| 0.8743055555555556 | 0 |
| 0.875 | 0 |
| 0.8756944444444444 | 0 |
| 0.876388888888889 | 0 |
| 0.8770833333333333 | 0 |
| 0.8777777777777778 | 0 |
| 0.8784722222222222 | 0 |
| 0.8791666666666668 | 0 |
| 0.8798611111111111 | 0 |
| 0.8805555555555555 | 0 |
| 0.88125 | 0 |
| 0.8819444444444445 | 0 |
| 0.8826388888888889 | 0 |
| 0.8833333333333333 | 0 |
| 0.8840277777777777 | 0 |
| 0.8847222222222223 | 0 |
| 0.8854166666666666 | 0 |
| 0.8861111111111111 | 0 |
| 0.8868055555555556 | 0 |
| 0.8875000000000001 | 0 |
| 0.8881944444444444 | 0 |
| 0.8888888888888888 | 0 |
| 0.8895833333333334 | 0 |
| 0.8902777777777778 | 0 |
| 0.8909722222222222 | 0 |
| 0.8916666666666666 | 0 |
| 0.8923611111111112 | 0 |
| 0.8930555555555556 | 0 |
| 0.8937499999999999 | 0 |
| 0.8944444444444444 | 0 |
| 0.8951388888888889 | 0 |
| 0.8958333333333334 | 0 |
| 0.8965277777777777 | 0 |
| 0.8972222222222223 | 0 |
| 0.8979166666666667 | 0 |
| 0.8986111111111111 | 0 |
| 0.8993055555555555 | 0 |
| 0.9 | 0 |
| 0.9006944444444445 | 0 |
| 0.9013888888888889 | 0 |
| 0.9020833333333332 | 0 |
| 0.9027777777777778 | 0 |
| 0.9034722222222222 | 0 |
| 0.9041666666666667 | 0 |
| 0.904861111111111 | 0 |
| 0.9055555555555556 | 0 |
| 0.90625 | 0 |
| 0.9069444444444444 | 0 |
| 0.907638888888889 | 0 |
| 0.9083333333333333 | 0 |
| 0.9090277777777778 | 0 |
| 0.9097222222222222 | 0 |
| 0.9104166666666668 | 0 |
| 0.9111111111111111 | 0 |
| 0.9118055555555555 | 0 |
| 0.9125 | 0 |
| 0.9131944444444445 | 0 |
| 0.9138888888888889 | 0 |
| 0.9145833333333333 | 0 |
| 0.9152777777777777 | 0 |
| 0.9159722222222223 | 0 |
| 0.9166666666666666 | 0 |
| 0.9173611111111111 | 0 |
| 0.9180555555555556 | 0 |
| 0.9187500000000001 | 0 |
| 0.9194444444444444 | 0 |
| 0.9201388888888888 | 0 |
| 0.9208333333333334 | 0 |
| 0.9215277777777778 | 0 |
| 0.9222222222222222 | 0 |
| 0.9229166666666666 | 0 |
| 0.9236111111111112 | 0 |
| 0.9243055555555556 | 0 |
| 0.9249999999999999 | 0 |
| 0.9256944444444444 | 0 |
| 0.9263888888888889 | 0 |
| 0.9270833333333334 | 0 |
| 0.9277777777777777 | 0 |
| 0.9284722222222223 | 0 |
| 0.9291666666666667 | 0 |
| 0.9298611111111111 | 0 |
| 0.9305555555555555 | 0 |
| 0.93125 | 0 |
| 0.9319444444444445 | 0 |
| 0.9326388888888889 | 0 |
| 0.9333333333333332 | 0 |
| 0.9340277777777778 | 0 |
| 0.9347222222222222 | 0 |
| 0.9354166666666667 | 0 |
| 0.936111111111111 | 0 |
| 0.9368055555555556 | 0 |
| 0.9375 | 0 |
| 0.9381944444444444 | 0 |
| 0.938888888888889 | 0 |
| 0.9395833333333333 | 0 |
| 0.9402777777777778 | 0 |
| 0.9409722222222222 | 0 |
| 0.9416666666666668 | 0 |
| 0.9423611111111111 | 0 |
| 0.9430555555555555 | 0 |
| 0.94375 | 0 |
| 0.9444444444444445 | 0 |
| 0.9451388888888889 | 0 |
| 0.9458333333333333 | 0 |
| 0.9465277777777777 | 0 |
| 0.9472222222222223 | 0 |
| 0.9479166666666666 | 0 |
| 0.9486111111111111 | 0 |
| 0.9493055555555556 | 0 |
| 0.9500000000000001 | 0 |
| 0.9506944444444444 | 0 |
| 0.9513888888888888 | 0 |
| 0.9520833333333334 | 0 |
| 0.9527777777777778 | 0 |
| 0.9534722222222222 | 0 |
| 0.9541666666666666 | 0 |
| 0.9548611111111112 | 0 |
| 0.9555555555555556 | 0 |
| 0.9562499999999999 | 0 |
| 0.9569444444444444 | 0 |
| 0.9576388888888889 | 0 |
| 0.9583333333333334 | 0 |
| 0.9590277777777777 | 0 |
| 0.9597222222222223 | 0 |
| 0.9604166666666667 | 0 |
| 0.9611111111111111 | 0 |
| 0.9618055555555555 | 0 |
| 0.9625 | 0 |
| 0.9631944444444445 | 0 |
| 0.9638888888888889 | 0 |
| 0.9645833333333332 | 0 |
| 0.9652777777777778 | 0 |
| 0.9659722222222222 | 0 |
| 0.9666666666666667 | 0 |
| 0.967361111111111 | 0 |
| 0.9680555555555556 | 0 |
| 0.96875 | 0 |
| 0.9694444444444444 | 0 |
| 0.970138888888889 | 0 |
| 0.9708333333333333 | 0 |
| 0.9715277777777778 | 0 |
| 0.9722222222222222 | 0 |
| 0.9729166666666668 | 0 |
| 0.9736111111111111 | 0 |
| 0.9743055555555555 | 0 |
| 0.975 | 0 |
| 0.9756944444444445 | 0 |
| 0.9763888888888889 | 0 |
| 0.9770833333333333 | 0 |
| 0.9777777777777777 | 0 |
| 0.9784722222222223 | 0 |
| 0.9791666666666666 | 0 |
| 0.9798611111111111 | 0 |
| 0.9805555555555556 | 0 |
| 0.9812500000000001 | 0 |
| 0.9819444444444444 | 0 |
| 0.9826388888888888 | 0 |
| 0.9833333333333334 | 0 |
| 0.9840277777777778 | 0 |
| 0.9847222222222222 | 0 |
| 0.9854166666666666 | 0 |
| 0.9861111111111112 | 0 |
| 0.9868055555555556 | 0 |
| 0.9874999999999999 | 0 |
| 0.9881944444444444 | 0 |
| 0.9888888888888889 | 0 |
| 0.9895833333333334 | 0 |
| 0.9902777777777777 | 0 |
| 0.9909722222222223 | 0 |
| 0.9916666666666667 | 0 |
| 0.9923611111111111 | 0 |
| 0.9930555555555555 | 0 |
| 0.99375 | 0 |
| 0.9944444444444445 | 0 |
| 0.9951388888888889 | 0 |
| 0.9958333333333332 | 0 |
| 0.9965277777777778 | 0 |
| 0.9972222222222222 | 0 |
| 0.9979166666666667 | 0 |
| 0.998611111111111 | 0 |
| 0.9993055555555556 | 0 |